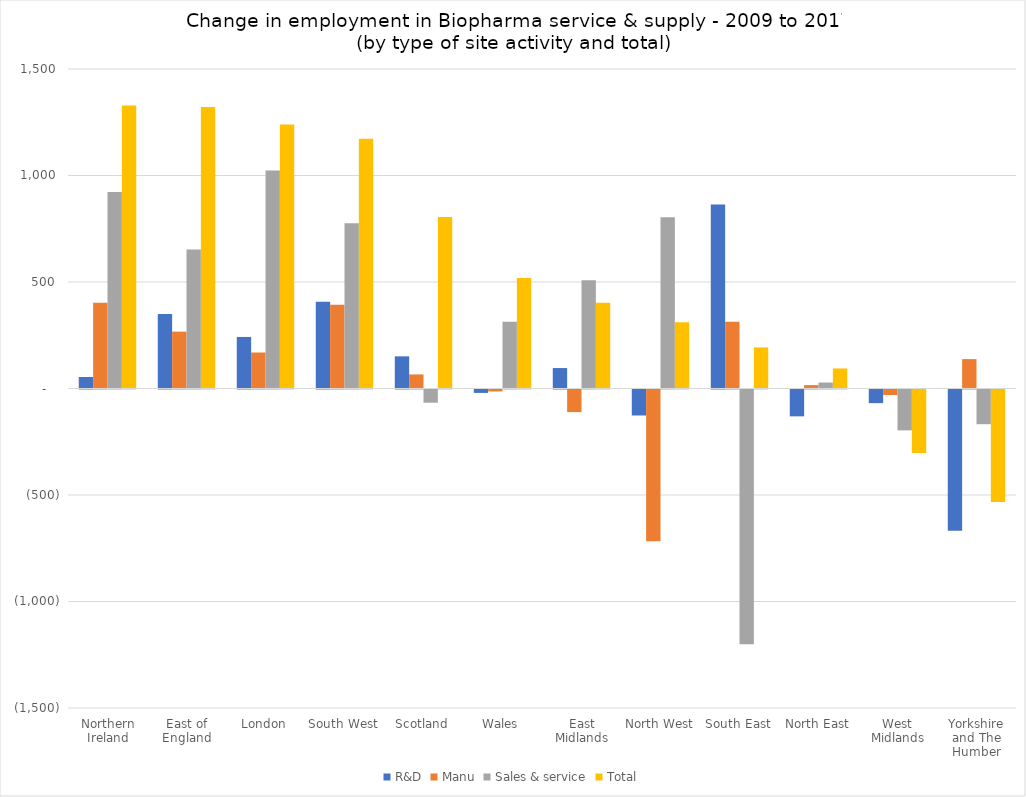
| Category | R&D | Manu | Sales & service | Total |
|---|---|---|---|---|
| Northern Ireland | 54 | 402 | 922 | 1329 |
| East of England | 350 | 267 | 652 | 1322 |
| London | 242 | 169 | 1023 | 1239 |
| South West | 407 | 393 | 776 | 1172 |
| Scotland | 151 | 66 | -62 | 805 |
| Wales | -16 | -9 | 313 | 519 |
| East Midlands | 96 | -106 | 508 | 403 |
| North West | -122 | -713 | 804 | 311 |
| South East | 864 | 313 | -1196 | 193 |
| North East | -126 | 16 | 28 | 94 |
| West Midlands | -64 | -26 | -192 | -298 |
| Yorkshire and The Humber | -663 | 138 | -163 | -528 |